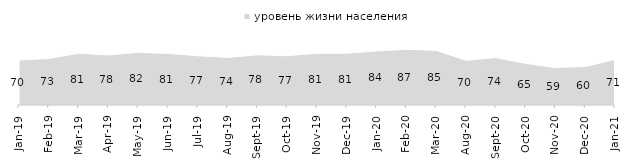
| Category | уровень жизни населения |
|---|---|
| 2019-01-01 | 70.25 |
| 2019-02-01 | 72.55 |
| 2019-03-01 | 80.806 |
| 2019-04-01 | 78.168 |
| 2019-05-01 | 82.169 |
| 2019-06-01 | 80.648 |
| 2019-07-01 | 76.881 |
| 2019-08-01 | 74.276 |
| 2019-09-01 | 78.465 |
| 2019-10-01 | 76.931 |
| 2019-11-01 | 80.842 |
| 2019-12-01 | 80.792 |
| 2020-01-01 | 84.406 |
| 2020-02-01 | 87.129 |
| 2020-03-01 | 85.275 |
| 2020-08-01 | 69.911 |
| 2020-09-01 | 74.116 |
| 2020-10-01 | 64.973 |
| 2020-11-01 | 58.55 |
| 2020-12-01 | 60.139 |
| 2021-01-01 | 71.038 |